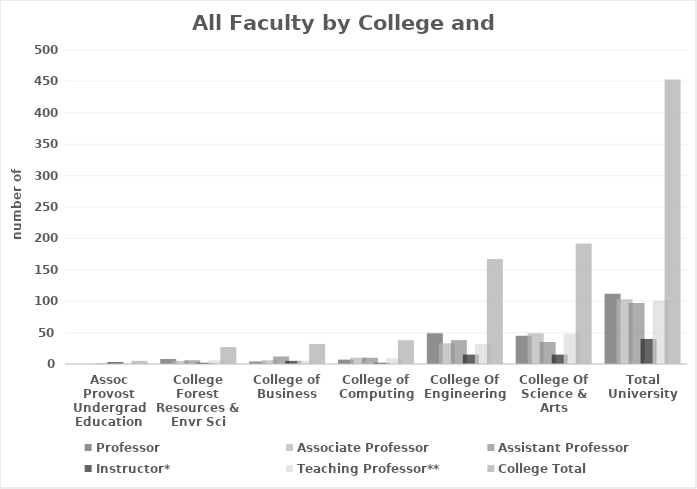
| Category | Professor  | Associate Professor  | Assistant Professor  | Instructor*  | Teaching Professor**  | College Total |
|---|---|---|---|---|---|---|
| Assoc Provost Undergrad Education | 0 | 0 | 1 | 3 | 1 | 5 |
| College Forest Resources & Envr Sci | 8 | 5 | 6 | 2 | 6 | 27 |
| College of Business | 4 | 6 | 12 | 5 | 5 | 32 |
| College of Computing | 7 | 10 | 10 | 2 | 9 | 38 |
| College Of Engineering | 49 | 33 | 38 | 15 | 32 | 167 |
| College Of Science & Arts | 45 | 49 | 35 | 15 | 48 | 192 |
| Total University | 112 | 103 | 97 | 40 | 101 | 453 |